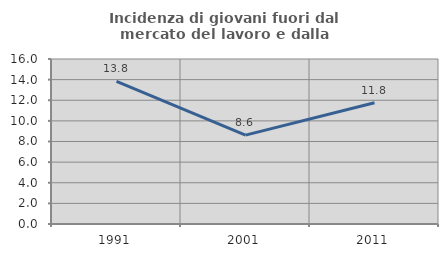
| Category | Incidenza di giovani fuori dal mercato del lavoro e dalla formazione  |
|---|---|
| 1991.0 | 13.834 |
| 2001.0 | 8.616 |
| 2011.0 | 11.765 |